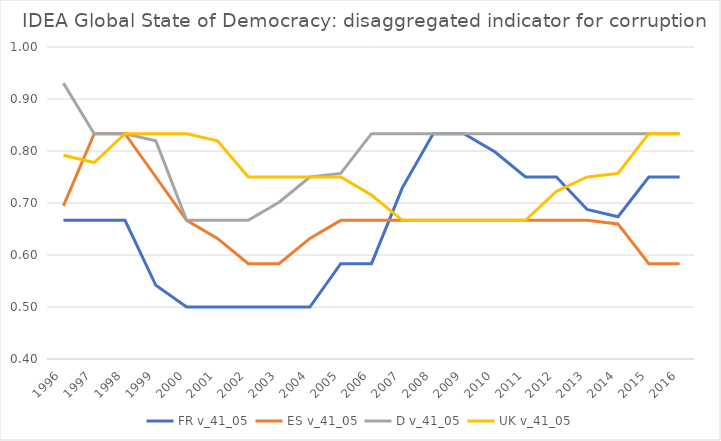
| Category | FR | ES | D | UK |
|---|---|---|---|---|
| 1996.0 | 0.667 | 0.694 | 0.931 | 0.792 |
| 1997.0 | 0.667 | 0.833 | 0.833 | 0.778 |
| 1998.0 | 0.667 | 0.833 | 0.833 | 0.833 |
| 1999.0 | 0.542 | 0.75 | 0.819 | 0.833 |
| 2000.0 | 0.5 | 0.667 | 0.667 | 0.833 |
| 2001.0 | 0.5 | 0.632 | 0.667 | 0.819 |
| 2002.0 | 0.5 | 0.583 | 0.667 | 0.75 |
| 2003.0 | 0.5 | 0.583 | 0.701 | 0.75 |
| 2004.0 | 0.5 | 0.632 | 0.75 | 0.75 |
| 2005.0 | 0.583 | 0.667 | 0.757 | 0.75 |
| 2006.0 | 0.583 | 0.667 | 0.833 | 0.715 |
| 2007.0 | 0.729 | 0.667 | 0.833 | 0.667 |
| 2008.0 | 0.833 | 0.667 | 0.833 | 0.667 |
| 2009.0 | 0.833 | 0.667 | 0.833 | 0.667 |
| 2010.0 | 0.799 | 0.667 | 0.833 | 0.667 |
| 2011.0 | 0.75 | 0.667 | 0.833 | 0.667 |
| 2012.0 | 0.75 | 0.667 | 0.833 | 0.722 |
| 2013.0 | 0.688 | 0.667 | 0.833 | 0.75 |
| 2014.0 | 0.674 | 0.66 | 0.833 | 0.757 |
| 2015.0 | 0.75 | 0.583 | 0.833 | 0.833 |
| 2016.0 | 0.75 | 0.583 | 0.833 | 0.833 |